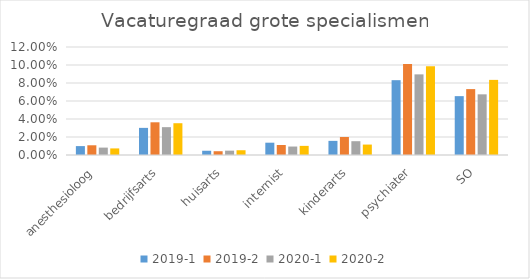
| Category | 2019-1 | 2019-2 | 2020-1 | 2020-2 |
|---|---|---|---|---|
| anesthesioloog | 0.01 | 0.011 | 0.008 | 0.007 |
| bedrijfsarts | 0.03 | 0.036 | 0.031 | 0.035 |
| huisarts | 0.005 | 0.004 | 0.005 | 0.005 |
| internist | 0.014 | 0.011 | 0.009 | 0.01 |
| kinderarts | 0.016 | 0.02 | 0.015 | 0.012 |
| psychiater | 0.083 | 0.101 | 0.09 | 0.099 |
| SO | 0.065 | 0.073 | 0.067 | 0.083 |